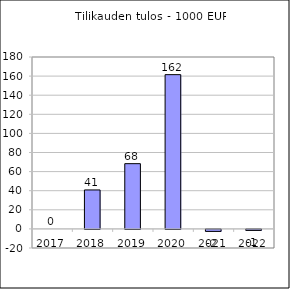
| Category | Tilikauden tulos |
|---|---|
| 2017.0 | 0 |
| 2018.0 | 40796.16 |
| 2019.0 | 68302.496 |
| 2020.0 | 161520 |
| 2021.0 | -2100 |
| 2022.0 | -1050 |